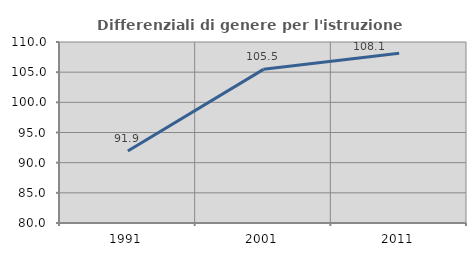
| Category | Differenziali di genere per l'istruzione superiore |
|---|---|
| 1991.0 | 91.934 |
| 2001.0 | 105.465 |
| 2011.0 | 108.123 |